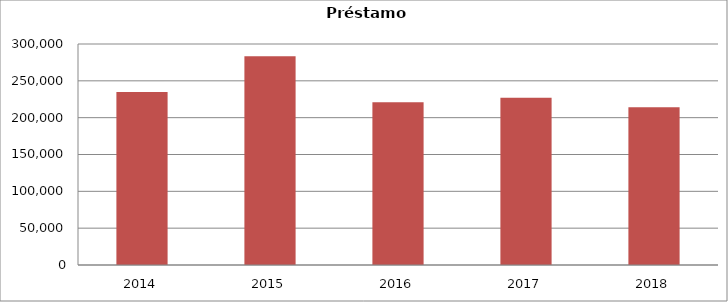
| Category | Prestamo bibliotecas |
|---|---|
| 2014.0 | 234954 |
| 2015.0 | 283266 |
| 2016.0 | 221008 |
| 2017.0 | 227183 |
| 2018.0 | 214030 |